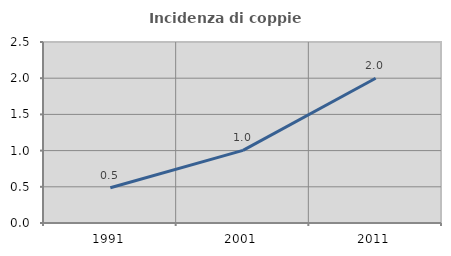
| Category | Incidenza di coppie miste |
|---|---|
| 1991.0 | 0.486 |
| 2001.0 | 1.003 |
| 2011.0 | 1.999 |